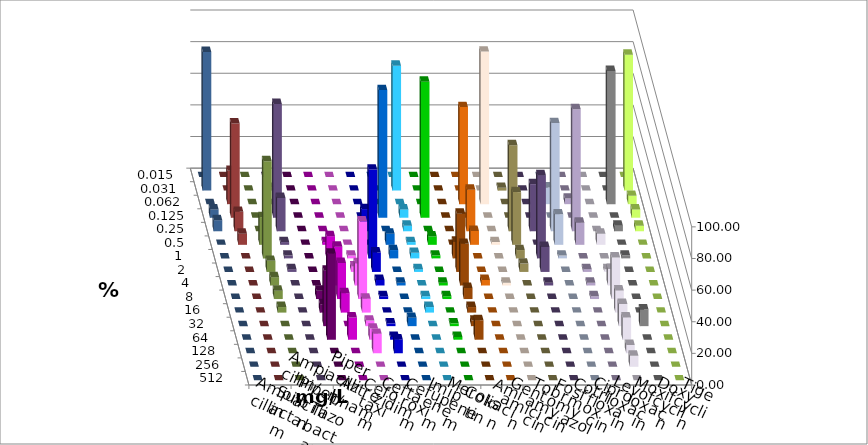
| Category | Ampicillin | Ampicillin/ Sulbactam | Piperacillin | Piperacillin/ Tazobactam | Aztreonam | Cefotaxim | Ceftazidim | Cefuroxim | Imipenem | Meropenem | Colistin | Amikacin | Gentamicin | Tobramycin | Fosfomycin | Cotrimoxazol | Ciprofloxacin | Levofloxacin | Moxifloxacin | Doxycyclin | Tigecyclin |
|---|---|---|---|---|---|---|---|---|---|---|---|---|---|---|---|---|---|---|---|---|---|
| 0.015 | 0 | 0 | 0 | 0 | 0 | 0 | 0 | 0 | 0 | 0 | 0 | 0 | 0 | 0 | 0 | 0 | 0 | 0 | 0 | 0 | 0 |
| 0.031 | 0 | 0 | 0 | 0 | 0 | 78.947 | 0 | 0 | 0 | 0 | 1.754 | 0 | 0 | 0 | 0 | 0 | 85.965 | 87.719 | 0 | 0 | 1.754 |
| 0.062 | 0 | 0 | 0 | 0 | 0 | 0 | 0 | 0 | 61.404 | 96.491 | 0 | 0 | 10.526 | 3.509 | 0 | 84.211 | 5.263 | 0 | 21.053 | 0 | 0 |
| 0.125 | 0 | 0 | 0 | 0 | 80.702 | 5.263 | 85.965 | 0 | 0 | 0 | 0 | 0 | 0 | 0 | 0 | 0 | 5.263 | 5.263 | 59.649 | 0 | 71.93 |
| 0.25 | 0 | 0 | 0 | 14.035 | 0 | 3.509 | 0 | 0 | 26.316 | 0 | 54.386 | 29.825 | 68.421 | 77.193 | 0 | 3.509 | 3.509 | 7.018 | 12.281 | 0 | 21.053 |
| 0.5 | 0 | 1.754 | 0 | 0 | 7.018 | 1.754 | 5.263 | 0 | 8.772 | 1.754 | 33.333 | 0 | 19.298 | 14.035 | 7.018 | 0 | 0 | 0 | 7.018 | 17.544 | 1.754 |
| 1.0 | 0 | 14.035 | 1.754 | 56.14 | 5.263 | 3.509 | 1.754 | 10.526 | 0 | 0 | 5.263 | 52.632 | 1.754 | 0 | 0 | 1.754 | 0 | 0 | 0 | 61.404 | 1.754 |
| 2.0 | 0 | 10.526 | 3.509 | 12.281 | 0 | 1.754 | 0 | 36.842 | 0 | 0 | 5.263 | 15.789 | 0 | 1.754 | 1.754 | 0 | 0 | 0 | 0 | 7.018 | 1.754 |
| 4.0 | 0 | 24.561 | 14.035 | 3.509 | 1.754 | 0 | 1.754 | 26.316 | 3.509 | 1.754 | 0 | 1.754 | 0 | 1.754 | 10.526 | 0 | 0 | 0 | 0 | 5.263 | 0 |
| 8.0 | 5.263 | 22.807 | 49.123 | 1.754 | 0 | 1.754 | 1.754 | 7.018 | 0 | 0 | 0 | 0 | 0 | 1.754 | 26.316 | 0 | 0 | 0 | 0 | 5.263 | 0 |
| 16.0 | 5.263 | 12.281 | 8.772 | 0 | 0 | 3.509 | 0 | 3.509 | 0 | 0 | 0 | 0 | 0 | 0 | 14.035 | 0 | 0 | 0 | 0 | 3.509 | 0 |
| 32.0 | 35.088 | 0 | 3.509 | 1.754 | 5.263 | 0 | 1.754 | 3.509 | 0 | 0 | 0 | 0 | 0 | 0 | 14.035 | 10.526 | 0 | 0 | 0 | 0 | 0 |
| 64.0 | 54.386 | 14.035 | 7.018 | 1.754 | 0 | 0 | 1.754 | 12.281 | 0 | 0 | 0 | 0 | 0 | 0 | 14.035 | 0 | 0 | 0 | 0 | 0 | 0 |
| 128.0 | 0 | 0 | 12.281 | 8.772 | 0 | 0 | 0 | 0 | 0 | 0 | 0 | 0 | 0 | 0 | 5.263 | 0 | 0 | 0 | 0 | 0 | 0 |
| 256.0 | 0 | 0 | 0 | 0 | 0 | 0 | 0 | 0 | 0 | 0 | 0 | 0 | 0 | 0 | 7.018 | 0 | 0 | 0 | 0 | 0 | 0 |
| 512.0 | 0 | 0 | 0 | 0 | 0 | 0 | 0 | 0 | 0 | 0 | 0 | 0 | 0 | 0 | 0 | 0 | 0 | 0 | 0 | 0 | 0 |